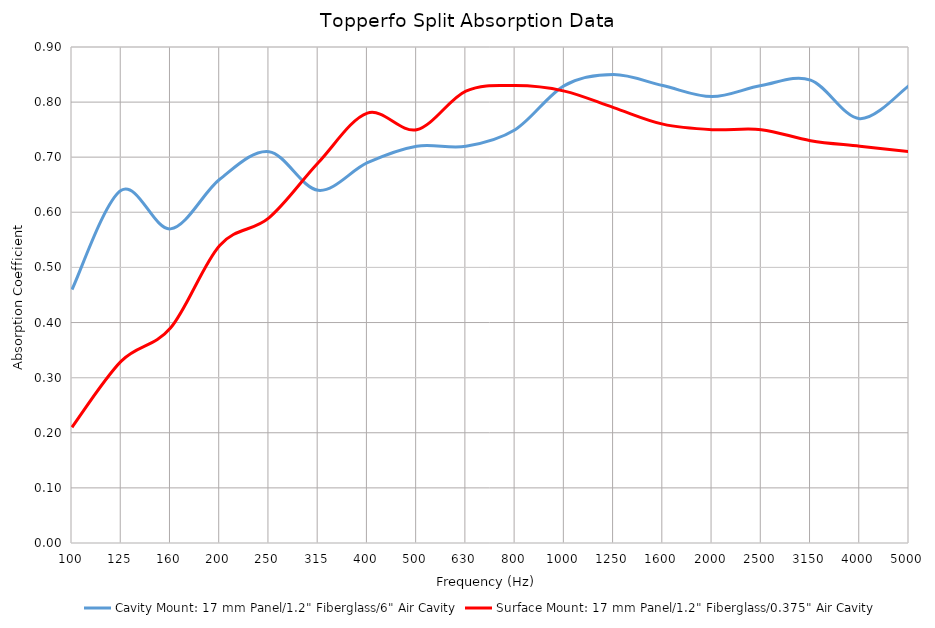
| Category | Cavity Mount: 17 mm Panel/1.2" Fiberglass/6" Air Cavity | Surface Mount: 17 mm Panel/1.2" Fiberglass/0.375" Air Cavity |
|---|---|---|
| 100.0 | 0.46 | 0.21 |
| 125.0 | 0.64 | 0.33 |
| 160.0 | 0.57 | 0.39 |
| 200.0 | 0.66 | 0.54 |
| 250.0 | 0.71 | 0.59 |
| 315.0 | 0.64 | 0.69 |
| 400.0 | 0.69 | 0.78 |
| 500.0 | 0.72 | 0.75 |
| 630.0 | 0.72 | 0.82 |
| 800.0 | 0.75 | 0.83 |
| 1000.0 | 0.83 | 0.82 |
| 1250.0 | 0.85 | 0.79 |
| 1600.0 | 0.83 | 0.76 |
| 2000.0 | 0.81 | 0.75 |
| 2500.0 | 0.83 | 0.75 |
| 3150.0 | 0.84 | 0.73 |
| 4000.0 | 0.77 | 0.72 |
| 5000.0 | 0.83 | 0.71 |